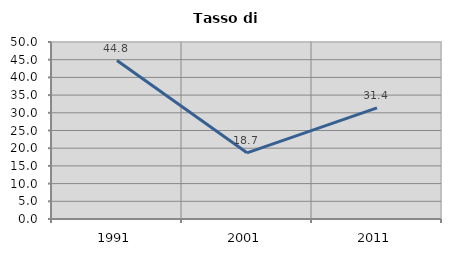
| Category | Tasso di disoccupazione   |
|---|---|
| 1991.0 | 44.767 |
| 2001.0 | 18.699 |
| 2011.0 | 31.387 |